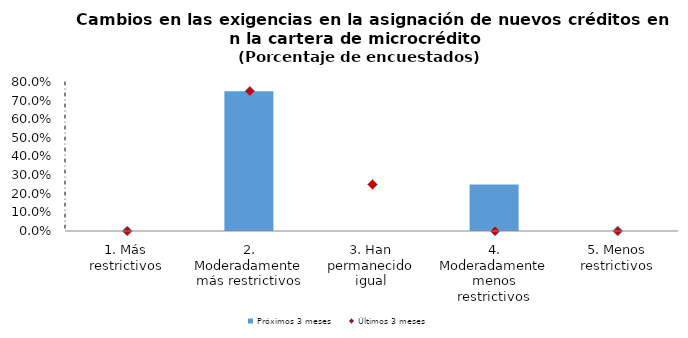
| Category | Próximos 3 meses |
|---|---|
| 1. Más restrictivos | 0 |
| 2. Moderadamente más restrictivos | 0.75 |
| 3. Han permanecido igual | 0 |
| 4. Moderadamente menos restrictivos | 0.25 |
| 5. Menos restrictivos | 0 |